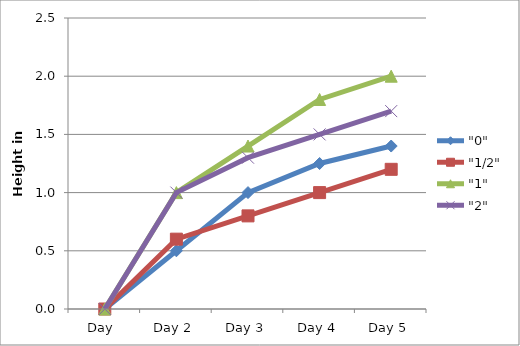
| Category | "0" | "1/2" | "1" | "2" |
|---|---|---|---|---|
| Day  | 0 | 0 | 0 | 0 |
| Day 2 | 0.5 | 0.6 | 1 | 1 |
| Day 3 | 1 | 0.8 | 1.4 | 1.3 |
| Day 4 | 1.25 | 1 | 1.8 | 1.5 |
| Day 5 | 1.4 | 1.2 | 2 | 1.7 |